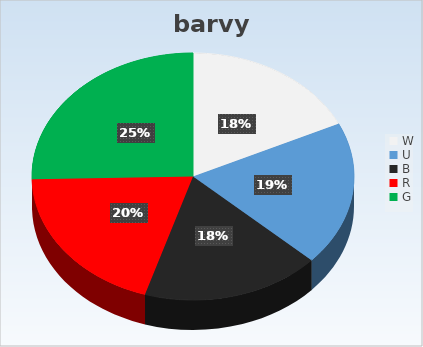
| Category | Series 0 |
|---|---|
| W | 12.933 |
| U | 13.6 |
| B | 12.933 |
| R | 14.267 |
| G | 18.267 |